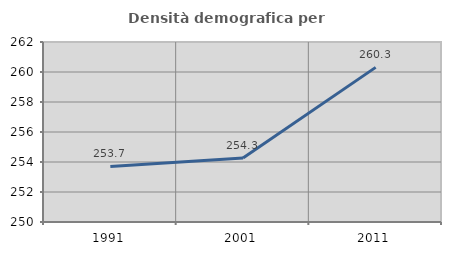
| Category | Densità demografica |
|---|---|
| 1991.0 | 253.702 |
| 2001.0 | 254.274 |
| 2011.0 | 260.309 |